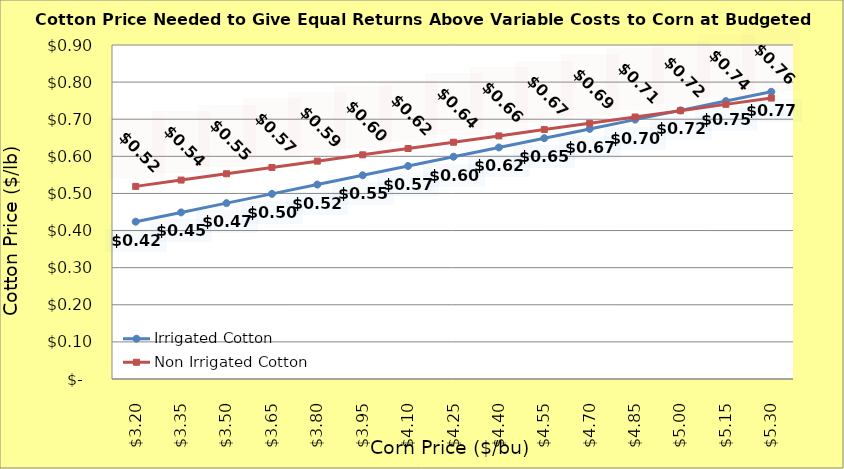
| Category | Irrigated Cotton | Non Irrigated Cotton |
|---|---|---|
| 3.2 | 0.424 | 0.519 |
| 3.35 | 0.449 | 0.536 |
| 3.5 | 0.474 | 0.553 |
| 3.65 | 0.499 | 0.57 |
| 3.8 | 0.524 | 0.587 |
| 3.9499999999999997 | 0.549 | 0.604 |
| 4.1 | 0.574 | 0.621 |
| 4.25 | 0.599 | 0.638 |
| 4.4 | 0.624 | 0.655 |
| 4.550000000000001 | 0.649 | 0.672 |
| 4.700000000000001 | 0.674 | 0.689 |
| 4.850000000000001 | 0.699 | 0.706 |
| 5.000000000000002 | 0.724 | 0.723 |
| 5.150000000000002 | 0.749 | 0.74 |
| 5.3000000000000025 | 0.774 | 0.757 |